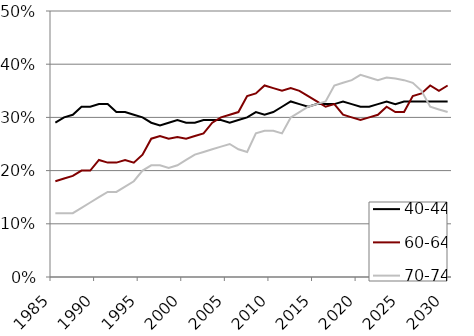
| Category | 40-44 | 60-64 | 70-74 |
|---|---|---|---|
| 1985.0 | 0.29 | 0.18 | 0.12 |
| 1986.0 | 0.3 | 0.185 | 0.12 |
| 1987.0 | 0.305 | 0.19 | 0.12 |
| 1988.0 | 0.32 | 0.2 | 0.13 |
| 1989.0 | 0.32 | 0.2 | 0.14 |
| 1990.0 | 0.325 | 0.22 | 0.15 |
| 1991.0 | 0.325 | 0.215 | 0.16 |
| 1992.0 | 0.31 | 0.215 | 0.16 |
| 1993.0 | 0.31 | 0.22 | 0.17 |
| 1994.0 | 0.305 | 0.215 | 0.18 |
| 1995.0 | 0.3 | 0.23 | 0.2 |
| 1996.0 | 0.29 | 0.26 | 0.21 |
| 1997.0 | 0.285 | 0.265 | 0.21 |
| 1998.0 | 0.29 | 0.26 | 0.205 |
| 1999.0 | 0.295 | 0.263 | 0.21 |
| 2000.0 | 0.29 | 0.26 | 0.22 |
| 2001.0 | 0.29 | 0.265 | 0.23 |
| 2002.0 | 0.295 | 0.27 | 0.235 |
| 2003.0 | 0.295 | 0.29 | 0.24 |
| 2004.0 | 0.295 | 0.3 | 0.245 |
| 2005.0 | 0.29 | 0.305 | 0.25 |
| 2006.0 | 0.295 | 0.31 | 0.24 |
| 2007.0 | 0.3 | 0.34 | 0.235 |
| 2008.0 | 0.31 | 0.345 | 0.27 |
| 2009.0 | 0.305 | 0.36 | 0.275 |
| 2010.0 | 0.31 | 0.355 | 0.275 |
| 2011.0 | 0.32 | 0.35 | 0.27 |
| 2012.0 | 0.33 | 0.355 | 0.3 |
| 2013.0 | 0.325 | 0.35 | 0.31 |
| 2014.0 | 0.32 | 0.34 | 0.32 |
| 2015.0 | 0.325 | 0.33 | 0.325 |
| 2016.0 | 0.325 | 0.32 | 0.33 |
| 2017.0 | 0.325 | 0.325 | 0.36 |
| 2018.0 | 0.33 | 0.305 | 0.365 |
| 2019.0 | 0.325 | 0.3 | 0.37 |
| 2020.0 | 0.32 | 0.295 | 0.38 |
| 2021.0 | 0.32 | 0.3 | 0.375 |
| 2022.0 | 0.325 | 0.305 | 0.37 |
| 2023.0 | 0.33 | 0.32 | 0.375 |
| 2024.0 | 0.325 | 0.31 | 0.373 |
| 2025.0 | 0.33 | 0.31 | 0.37 |
| 2026.0 | 0.33 | 0.34 | 0.365 |
| 2027.0 | 0.33 | 0.345 | 0.35 |
| 2028.0 | 0.33 | 0.36 | 0.32 |
| 2029.0 | 0.33 | 0.35 | 0.315 |
| 2030.0 | 0.33 | 0.36 | 0.31 |